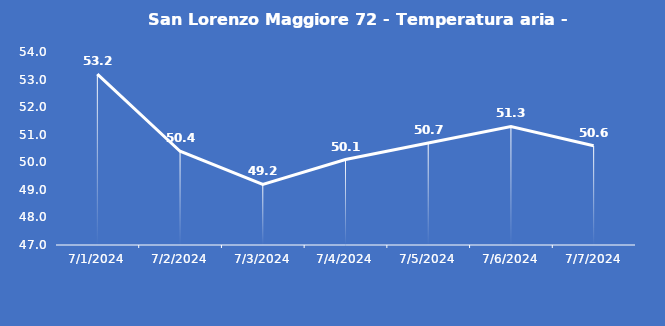
| Category | San Lorenzo Maggiore 72 - Temperatura aria - Grezzo (°C) |
|---|---|
| 7/1/24 | 53.2 |
| 7/2/24 | 50.4 |
| 7/3/24 | 49.2 |
| 7/4/24 | 50.1 |
| 7/5/24 | 50.7 |
| 7/6/24 | 51.3 |
| 7/7/24 | 50.6 |